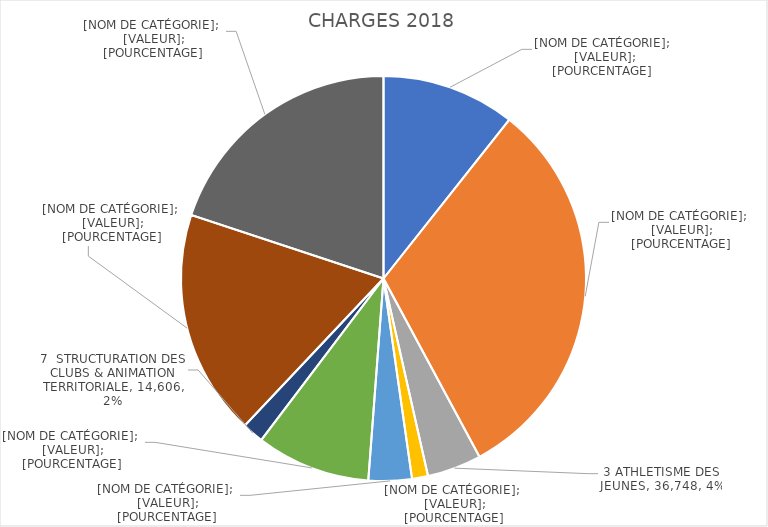
| Category | Series 0 |
|---|---|
| 1 ATHLETISME COMPETITION | 90376.269 |
| 2 SUIVI ATHLETES | 266835.43 |
| 3 ATHLETISME DES JEUNES | 36747.685 |
| 4 ATHLE HORS STADE | 10798.995 |
| 5 ATHLE SANTE LOISIRS | 29264.743 |
| 6 FORMATIONS | 77252.077 |
| 7  STRUCTURATION DES CLUBS & ANIMATION TERRITORIALE | 14606.24 |
| 8 STRUCTURE REGIONALE | 152983.977 |
| 9 ADMINISTRATION | 168878.545 |